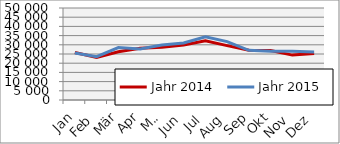
| Category | Jahr 2014 | Jahr 2015 |
|---|---|---|
| Jan | 25803.868 | 25528.553 |
| Feb | 23139.128 | 23578.608 |
| Mär | 26181.825 | 28502.813 |
| Apr | 28083.628 | 27719.716 |
| Mai | 28672.738 | 29837.275 |
| Jun | 29878.371 | 30998.886 |
| Jul | 32192.859 | 34404.722 |
| Aug | 29543.721 | 31753.988 |
| Sep | 27063.712 | 26987.018 |
| Okt | 26933.236 | 26553.239 |
| Nov | 24395.588 | 26544.771 |
| Dez | 25291.391 | 26142.794 |